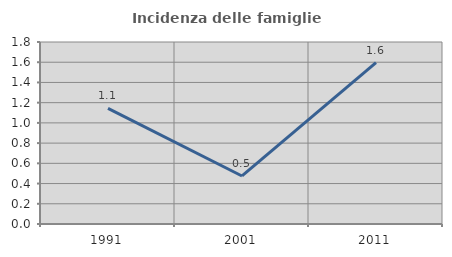
| Category | Incidenza delle famiglie numerose |
|---|---|
| 1991.0 | 1.144 |
| 2001.0 | 0.475 |
| 2011.0 | 1.597 |